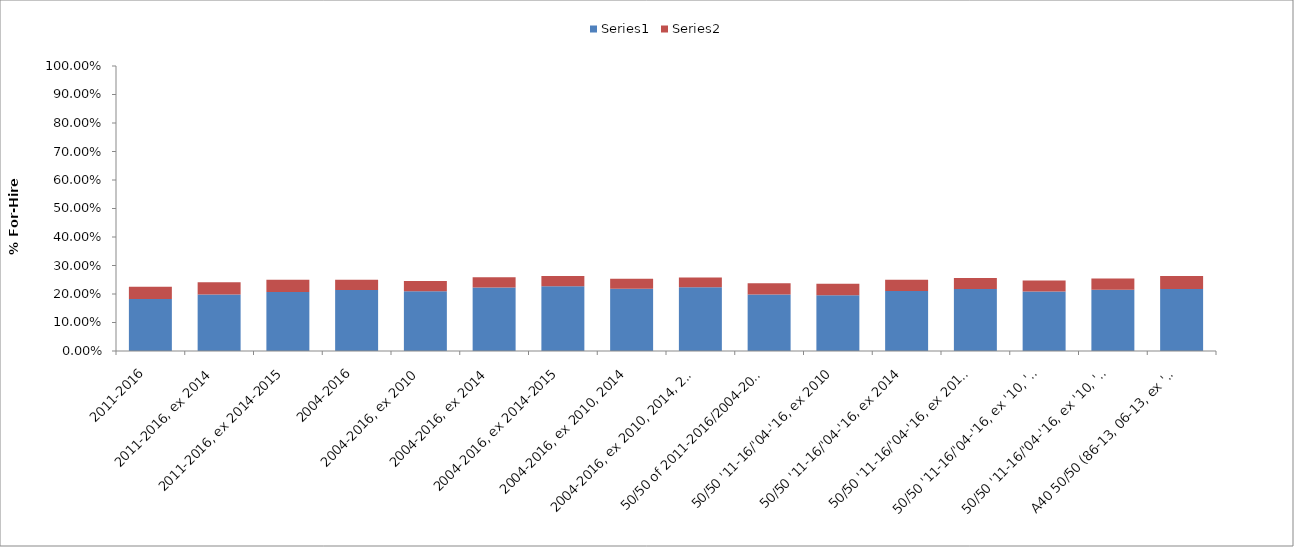
| Category | Series 0 | Series 1 |
|---|---|---|
| 2011-2016 | 0.182 | 0.043 |
| 2011-2016, ex 2014 | 0.198 | 0.043 |
| 2011-2016, ex 2014-2015 | 0.207 | 0.044 |
| 2004-2016 | 0.214 | 0.037 |
| 2004-2016, ex 2010 | 0.21 | 0.036 |
| 2004-2016, ex 2014 | 0.223 | 0.036 |
| 2004-2016, ex 2014-2015 | 0.228 | 0.035 |
| 2004-2016, ex 2010, 2014 | 0.219 | 0.035 |
| 2004-2016, ex 2010, 2014, 2015 | 0.224 | 0.034 |
| 50/50 of 2011-2016/2004-2016 | 0.198 | 0.04 |
| 50/50 '11-16/'04-'16, ex 2010 | 0.196 | 0.04 |
| 50/50 '11-16/'04-'16, ex 2014 | 0.21 | 0.04 |
| 50/50 '11-16/'04-'16, ex 2014-2015 | 0.217 | 0.039 |
| 50/50 '11-16/'04-'16, ex '10, '14 | 0.208 | 0.039 |
| 50/50 '11-16/'04-'16, ex '10, '14, '15 | 0.215 | 0.039 |
| A40 50/50 (86-13, 06-13, ex '10) | 0.217 | 0.046 |